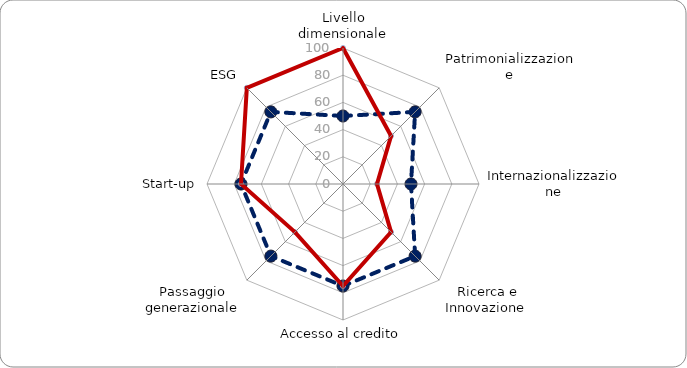
| Category | Valore | #REF! |
|---|---|---|
| Livello dimensionale | 50 | 100 |
| Patrimonializzazione | 75 | 50 |
| Internazionalizzazione | 50 | 25 |
| Ricerca e Innovazione  | 75 | 50 |
| Accesso al credito | 75 | 75 |
| Passaggio generazionale | 75 | 50 |
| Start-up | 75 | 75 |
| ESG | 75 | 100 |